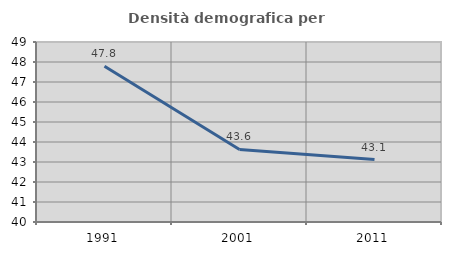
| Category | Densità demografica |
|---|---|
| 1991.0 | 47.784 |
| 2001.0 | 43.627 |
| 2011.0 | 43.124 |